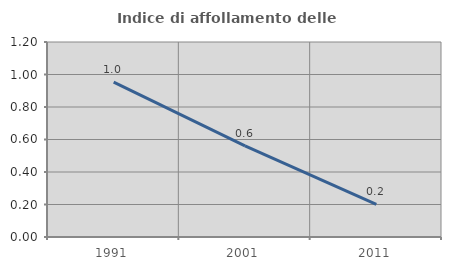
| Category | Indice di affollamento delle abitazioni  |
|---|---|
| 1991.0 | 0.954 |
| 2001.0 | 0.561 |
| 2011.0 | 0.2 |